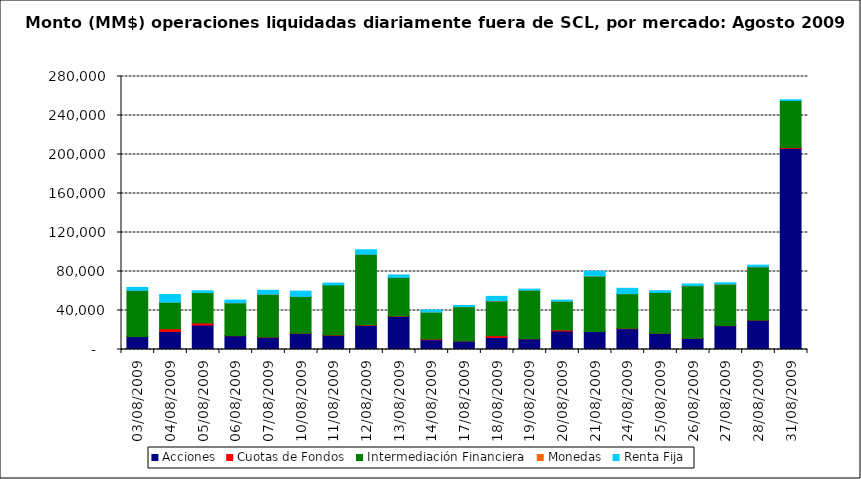
| Category | Acciones | Cuotas de Fondos | Intermediación Financiera | Monedas | Renta Fija |
|---|---|---|---|---|---|
| 03/08/2009 | 13365.341 | 0.008 | 47259.244 | 31.5 | 3014.403 |
| 04/08/2009 | 18454.449 | 2817.569 | 27183.927 | 30.15 | 7919.275 |
| 05/08/2009 | 25145.168 | 2090.795 | 31170.321 | 10.85 | 1754.449 |
| 06/08/2009 | 14150.619 | 113.478 | 33627.147 | 12.6 | 2732.608 |
| 07/08/2009 | 12768.672 | 41.839 | 43868.082 | 37.44 | 3978.524 |
| 10/08/2009 | 16532.647 | 233.42 | 37687.893 | 16.1 | 5371.218 |
| 11/08/2009 | 14689.299 | 105.883 | 51468.831 | 0 | 1846.873 |
| 12/08/2009 | 24774.369 | 293.721 | 72596.958 | 8.05 | 4579.11 |
| 13/08/2009 | 34021.208 | 248.027 | 39637.612 | 13.3 | 2535.529 |
| 14/08/2009 | 10063.95 | 638.883 | 27620.877 | 25.55 | 2175.747 |
| 17/08/2009 | 8736.056 | 0.374 | 35152.885 | 9.477 | 1313.422 |
| 18/08/2009 | 12495.529 | 1755.65 | 35703.007 | 12.95 | 4528.375 |
| 19/08/2009 | 10967.888 | 99.851 | 49761.035 | 6.635 | 1090.328 |
| 20/08/2009 | 18898.599 | 1104.391 | 29467.008 | 4.55 | 1178.811 |
| 21/08/2009 | 18573.701 | 6.861 | 56790.473 | 0.698 | 4893.512 |
| 24/08/2009 | 21301.677 | 420.979 | 35560.31 | 10.695 | 5439.246 |
| 25/08/2009 | 16551.561 | 3.055 | 41970.453 | 5.44 | 1738.936 |
| 26/08/2009 | 11513.413 | 16.441 | 53942.185 | 1.026 | 1724.946 |
| 27/08/2009 | 24437.899 | 146.245 | 42540.625 | 11.642 | 1273.893 |
| 28/08/2009 | 30208.111 | 89.374 | 54605.047 | 1.047 | 1580.531 |
| 31/08/2009 | 206276.697 | 909.817 | 48217.05 | 0 | 749.016 |